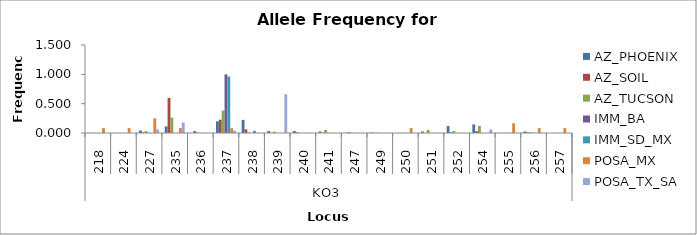
| Category | AZ_PHOENIX | AZ_SOIL | AZ_TUCSON | IMM_BA | IMM_SD_MX | POSA_MX | POSA_TX_SA |
|---|---|---|---|---|---|---|---|
| 0 | 0 | 0 | 0.004 | 0 | 0 | 0.083 | 0 |
| 1 | 0 | 0 | 0 | 0 | 0 | 0.083 | 0 |
| 2 | 0.043 | 0.01 | 0.032 | 0 | 0 | 0.25 | 0.06 |
| 3 | 0.112 | 0.598 | 0.262 | 0 | 0 | 0.083 | 0.18 |
| 4 | 0 | 0.031 | 0.007 | 0 | 0 | 0 | 0 |
| 5 | 0.198 | 0.227 | 0.383 | 1 | 0.962 | 0.083 | 0.04 |
| 6 | 0.224 | 0.062 | 0.007 | 0 | 0.038 | 0 | 0 |
| 7 | 0.034 | 0 | 0.021 | 0 | 0 | 0 | 0.66 |
| 8 | 0.034 | 0.01 | 0 | 0 | 0 | 0 | 0 |
| 9 | 0.026 | 0 | 0.053 | 0 | 0 | 0 | 0 |
| 10 | 0 | 0.01 | 0.007 | 0 | 0 | 0 | 0 |
| 11 | 0.009 | 0 | 0.004 | 0 | 0 | 0 | 0 |
| 12 | 0 | 0 | 0.004 | 0 | 0 | 0.083 | 0 |
| 13 | 0.026 | 0 | 0.053 | 0 | 0 | 0 | 0 |
| 14 | 0.121 | 0.01 | 0.032 | 0 | 0 | 0 | 0 |
| 15 | 0.147 | 0.031 | 0.121 | 0 | 0 | 0 | 0.06 |
| 16 | 0 | 0 | 0.004 | 0 | 0 | 0.167 | 0 |
| 17 | 0.026 | 0.01 | 0.007 | 0 | 0 | 0.083 | 0 |
| 18 | 0 | 0 | 0 | 0 | 0 | 0.083 | 0 |